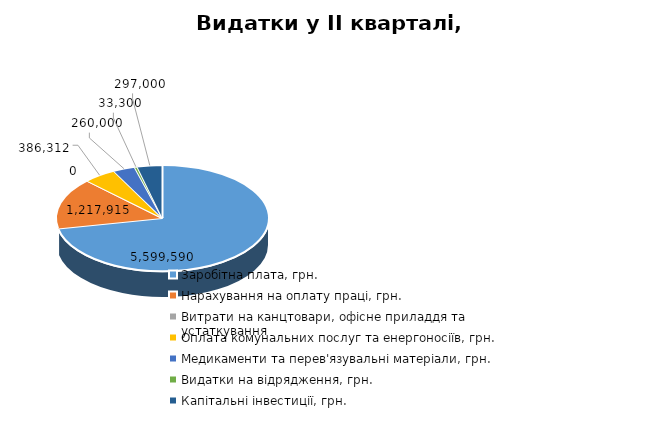
| Category | Видатки у ІІ кварталі, грн. |
|---|---|
| Заробітна плата, грн. | 5599590 |
| Нарахування на оплату праці, грн. | 1217915.4 |
| Витрати на канцтовари, офісне приладдя та устаткування  | 0 |
| Оплата комунальних послуг та енергоносіїв, грн. | 386312.336 |
| Медикаменти та перев'язувальні матеріали, грн. | 260000 |
| Видатки на відрядження, грн. | 33300 |
| Капітальні інвестиції, грн. | 297000 |